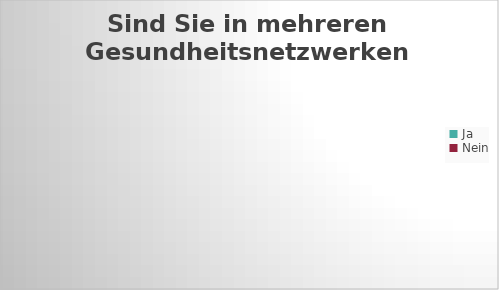
| Category | Sind Sie in mehreren Gesundheitsnetzwerken aktiv? |
|---|---|
| Ja | 0 |
| Nein | 0 |